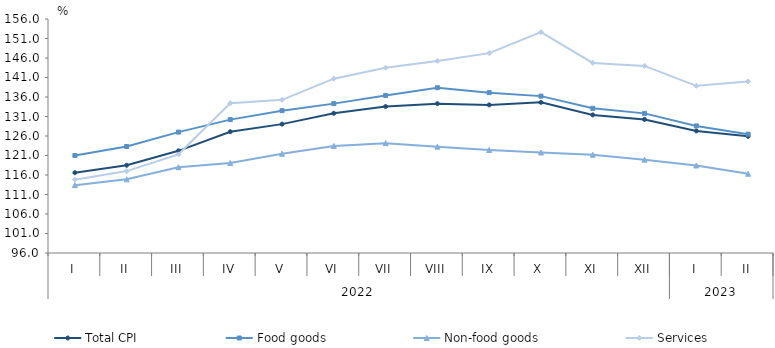
| Category | Total CPI | Food goods | Non-food goods | Services |
|---|---|---|---|---|
| 0 | 116.6 | 121 | 113.4 | 114.8 |
| 1 | 118.5 | 123.3 | 114.9 | 117 |
| 2 | 122.2 | 127 | 118 | 121.3 |
| 3 | 127.1 | 130.2 | 119.1 | 134.4 |
| 4 | 129.047 | 132.5 | 121.45 | 135.267 |
| 5 | 131.827 | 134.301 | 123.443 | 140.701 |
| 6 | 133.547 | 136.399 | 124.168 | 143.511 |
| 7 | 134.294 | 138.387 | 123.256 | 145.253 |
| 8 | 133.971 | 137.121 | 122.424 | 147.248 |
| 9 | 134.625 | 136.226 | 121.779 | 152.646 |
| 10 | 131.406 | 133.093 | 121.201 | 144.742 |
| 11 | 130.241 | 131.801 | 119.936 | 143.965 |
| 12 | 127.307 | 128.59 | 118.441 | 138.865 |
| 13 | 125.905 | 126.472 | 116.307 | 139.99 |